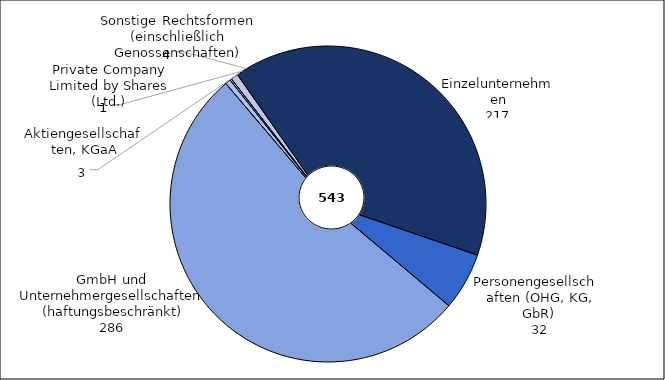
| Category | Series 0 |
|---|---|
| Einzelunternehmen | 217 |
| Personengesellschaften (OHG, KG, GbR) | 32 |
| Gesellschaften m.b.H. (einschließlich Unternehmergesellschaften (haftungsbeschränkt)) | 286 |
| Aktiengesellschaften, KGaA | 3 |
| Private Company Limited by Shares (Ltd.) | 1 |
| Sonstige Rechtsformen (einschließlich Genossenschaften) | 4 |